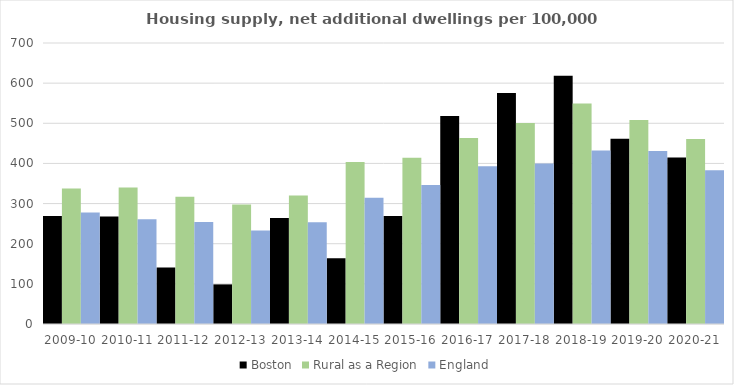
| Category | Boston | Rural as a Region | England |
|---|---|---|---|
| 2009-10 | 268.932 | 337.852 | 277.548 |
| 2010-11 | 267.546 | 340.105 | 260.994 |
| 2011-12 | 140.834 | 317.04 | 254.007 |
| 2012-13 | 98.682 | 297.763 | 233.153 |
| 2013-14 | 264.313 | 319.835 | 253.602 |
| 2014-15 | 164.023 | 403.796 | 314.256 |
| 2015-16 | 269.155 | 414.091 | 346.154 |
| 2016-17 | 518.395 | 463.209 | 393.256 |
| 2017-18 | 575.283 | 500.68 | 399.646 |
| 2018-19 | 618.459 | 549.491 | 432.099 |
| 2019-20 | 461.716 | 508.493 | 431.187 |
| 2020-21 | 415.037 | 461.114 | 382.827 |